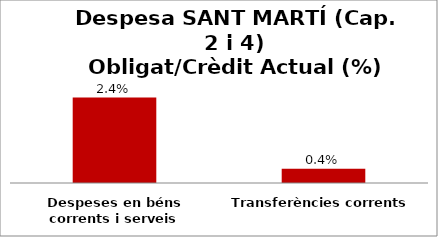
| Category | Series 0 |
|---|---|
| Despeses en béns corrents i serveis | 0.024 |
| Transferències corrents | 0.004 |